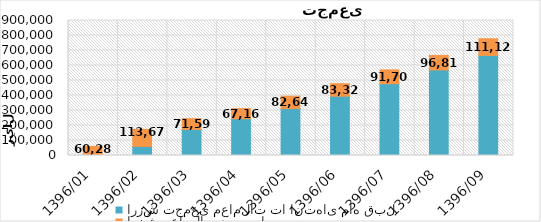
| Category | ارزش تجمعی معاملات تا انتهای ماه قبل | ارزش معاملات در هر ماه |
|---|---|---|
| 1396/01 | 0 | 60288 |
| 1396/02 | 60288 | 113671 |
| 1396/03 | 173959 | 71591 |
| 1396/04 | 245550 | 67162 |
| 1396/05 | 312712 | 82645 |
| 1396/06 | 395357 | 83323 |
| 1396/07 | 478680 | 91706 |
| 1396/08 | 570386 | 96819 |
| 1396/09 | 667205 | 111126 |